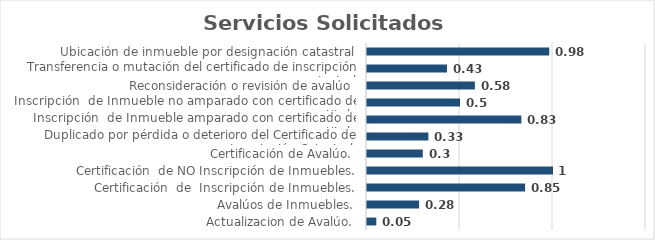
| Category | Series 0 | Series 1 | Series 2 | Series 3 | Series 4 | Series 5 |
|---|---|---|---|---|---|---|
| Actualizacion de Avalúo. |  |  |  |  |  | 0.05 |
| Avalúos de Inmuebles. |  |  |  |  |  | 0.28 |
| Certificación  de  Inscripción de Inmuebles. |  |  |  |  |  | 0.85 |
| Certificación  de NO Inscripción de Inmuebles. |  |  |  |  |  | 1 |
| Certificación de Avalúo. |  |  |  |  |  | 0.3 |
| Duplicado por pérdida o deterioro del Certificado de Inscripción Catastral. |  |  |  |  |  | 0.33 |
| Inscripción  de Inmueble amparado con certificado de titulo |  |  |  |  |  | 0.83 |
| Inscripción  de Inmueble no amparado con certificado de titulo |  |  |  |  |  | 0.5 |
| Reconsideración o revisión de avalúo |  |  |  |  |  | 0.58 |
| Transferencia o mutación del certificado de inscripción catastral |  |  |  |  |  | 0.43 |
| Ubicación de inmueble por designación catastral |  |  |  |  |  | 0.98 |